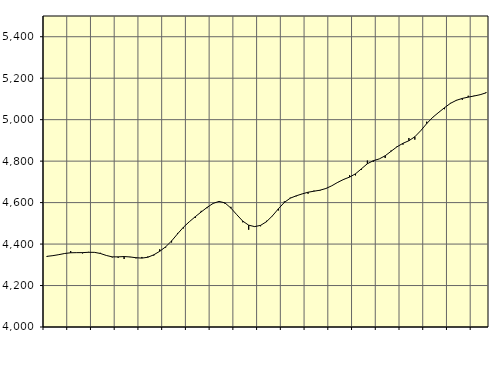
| Category | Piggar | Series 1 |
|---|---|---|
| nan | 4337.9 | 4340.74 |
| 1.0 | 4343.6 | 4344.11 |
| 1.0 | 4349.6 | 4349 |
| 1.0 | 4354.4 | 4354.65 |
| nan | 4366.4 | 4358 |
| 2.0 | 4358 | 4358.6 |
| 2.0 | 4354.8 | 4358.67 |
| 2.0 | 4362.2 | 4360.32 |
| nan | 4359.4 | 4360.01 |
| 3.0 | 4357.8 | 4354.58 |
| 3.0 | 4345.4 | 4345.06 |
| 3.0 | 4335.6 | 4338.28 |
| nan | 4333.7 | 4338.36 |
| 4.0 | 4327.9 | 4339.74 |
| 4.0 | 4337 | 4337.87 |
| 4.0 | 4331.2 | 4334.15 |
| nan | 4337.8 | 4332.28 |
| 5.0 | 4340.1 | 4336.36 |
| 5.0 | 4344.5 | 4348.13 |
| 5.0 | 4375 | 4365.01 |
| nan | 4383 | 4386.64 |
| 6.0 | 4407.7 | 4414.95 |
| 6.0 | 4453.6 | 4448.91 |
| 6.0 | 4475.5 | 4481.27 |
| nan | 4507.2 | 4507.86 |
| 7.0 | 4525.8 | 4532.16 |
| 7.0 | 4560.2 | 4554.89 |
| 7.0 | 4573.2 | 4577.01 |
| nan | 4595.2 | 4596.1 |
| 8.0 | 4606.1 | 4605.71 |
| 8.0 | 4594.6 | 4598.62 |
| 8.0 | 4579.6 | 4573.55 |
| nan | 4541.3 | 4541.46 |
| 9.0 | 4504.9 | 4510.66 |
| 9.0 | 4469.2 | 4491.08 |
| 9.0 | 4485.2 | 4484.22 |
| nan | 4485.8 | 4490.16 |
| 10.0 | 4512.2 | 4508 |
| 10.0 | 4534.5 | 4536.05 |
| 10.0 | 4562.1 | 4569.92 |
| nan | 4605.9 | 4600.68 |
| 11.0 | 4623.7 | 4621.21 |
| 11.0 | 4630.2 | 4632.61 |
| 11.0 | 4642.1 | 4641.84 |
| nan | 4642.5 | 4649.99 |
| 12.0 | 4657.7 | 4655 |
| 12.0 | 4657.3 | 4659.69 |
| 12.0 | 4669 | 4667.92 |
| nan | 4680.9 | 4681.06 |
| 13.0 | 4696 | 4697.55 |
| 13.0 | 4708.9 | 4711.83 |
| 13.0 | 4731.9 | 4722.99 |
| nan | 4731.1 | 4738.91 |
| 14.0 | 4758.5 | 4763.01 |
| 14.0 | 4802.8 | 4787.52 |
| 14.0 | 4797 | 4802.03 |
| nan | 4810.7 | 4810.73 |
| 15.0 | 4814.9 | 4825.8 |
| 15.0 | 4851.3 | 4847.62 |
| 15.0 | 4871.3 | 4869.28 |
| nan | 4879.4 | 4885.93 |
| 16.0 | 4911.6 | 4898.42 |
| 16.0 | 4903.6 | 4917.6 |
| 16.0 | 4946.5 | 4947.01 |
| nan | 4990.2 | 4980.98 |
| 17.0 | 5009.1 | 5010.87 |
| 17.0 | 5036.9 | 5034.59 |
| 17.0 | 5050.5 | 5057.6 |
| nan | 5080.7 | 5078.69 |
| 18.0 | 5095 | 5093.32 |
| 18.0 | 5095.8 | 5102.51 |
| 18.0 | 5115.4 | 5108.71 |
| nan | 5115.8 | 5114.22 |
| 19.0 | 5120.8 | 5120.4 |
| 19.0 | 5132.6 | 5129.43 |